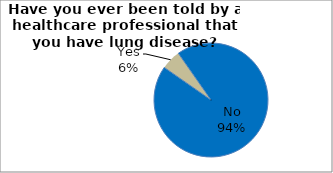
| Category | Series 0 |
|---|---|
| No | 94.405 |
| Yes | 5.595 |